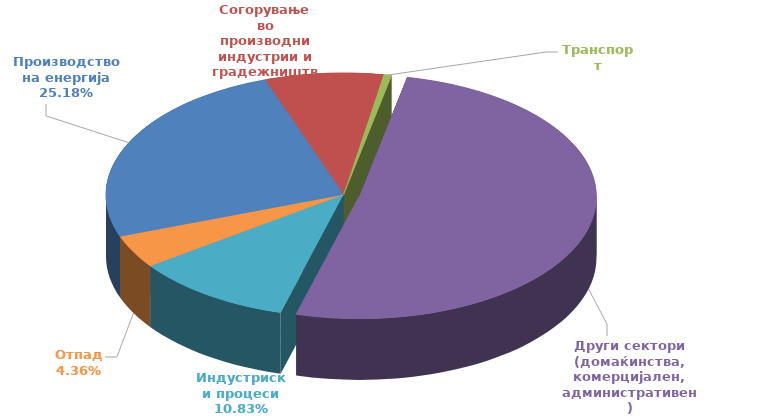
| Category | Cd [t] |
|---|---|
| 0 | 0.053 |
| 1 | 0.017 |
| 2 | 0.001 |
| 3 | 0.107 |
| 4 | 0.023 |
| 5 | 0.009 |